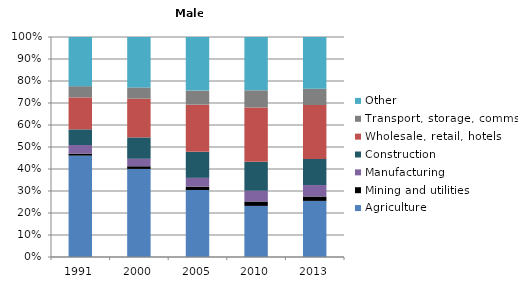
| Category | Agriculture | Mining and utilities | Manufacturing | Construction | Wholesale, retail, hotels | Transport, storage, comms | Other |
|---|---|---|---|---|---|---|---|
| 1991.0 | 46 | 0.9 | 3.9 | 7.1 | 14.5 | 5.1 | 22.3 |
| 2000.0 | 40 | 1.2 | 3.4 | 9.7 | 17.6 | 5.1 | 22.9 |
| 2005.0 | 30.4 | 1.5 | 4 | 11.8 | 21.4 | 6.4 | 24.3 |
| 2010.0 | 23.2 | 2 | 4.9 | 13.1 | 24.7 | 7.8 | 24.2 |
| 2013.0 | 25.5 | 2 | 5.2 | 11.9 | 24.5 | 7.4 | 23.5 |